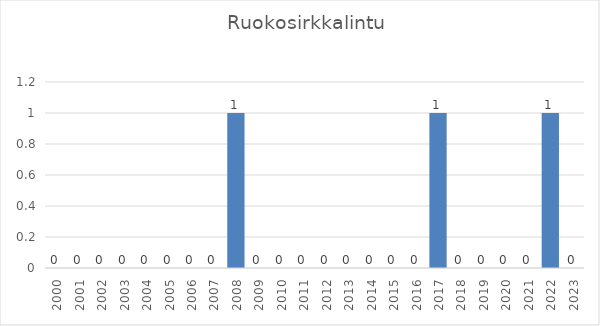
| Category | Series 0 |
|---|---|
| 2000.0 | 0 |
| 2001.0 | 0 |
| 2002.0 | 0 |
| 2003.0 | 0 |
| 2004.0 | 0 |
| 2005.0 | 0 |
| 2006.0 | 0 |
| 2007.0 | 0 |
| 2008.0 | 1 |
| 2009.0 | 0 |
| 2010.0 | 0 |
| 2011.0 | 0 |
| 2012.0 | 0 |
| 2013.0 | 0 |
| 2014.0 | 0 |
| 2015.0 | 0 |
| 2016.0 | 0 |
| 2017.0 | 1 |
| 2018.0 | 0 |
| 2019.0 | 0 |
| 2020.0 | 0 |
| 2021.0 | 0 |
| 2022.0 | 1 |
| 2023.0 | 0 |